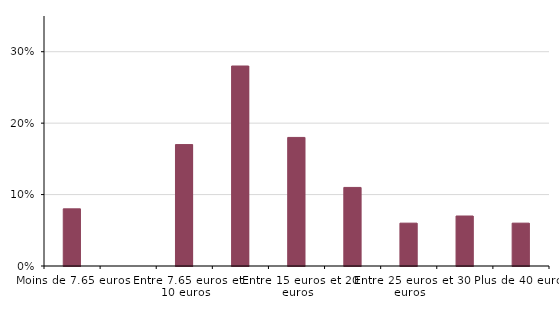
| Category | Series 0 |
|---|---|
| Moins de 7.65 euros | 0.08 |
| 7.65 euros | 0 |
| Entre 7.65 euros et 10 euros | 0.17 |
| Entre 10 euros et 15 euros | 0.28 |
| Entre 15 euros et 20 euros | 0.18 |
| Entre 20 euros et 25 euros | 0.11 |
| Entre 25 euros et 30 euros | 0.06 |
| Entre 30 euros et 40 euros | 0.07 |
| Plus de 40 euros | 0.06 |